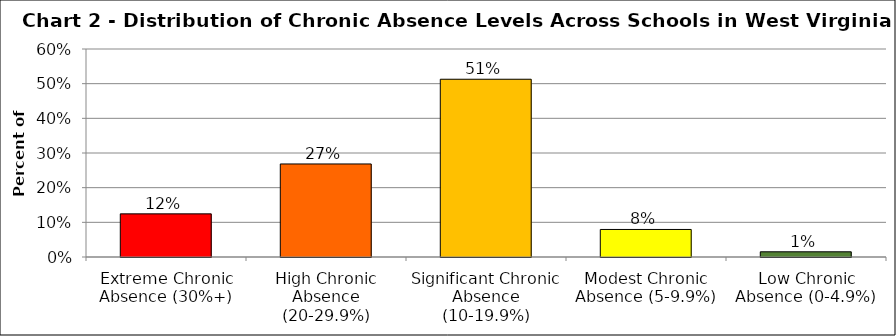
| Category | Series 1 |
|---|---|
| Extreme Chronic Absence (30%+) | 0.124 |
| High Chronic Absence (20-29.9%) | 0.268 |
| Significant Chronic Absence (10-19.9%) | 0.513 |
| Modest Chronic Absence (5-9.9%) | 0.079 |
| Low Chronic Absence (0-4.9%) | 0.015 |